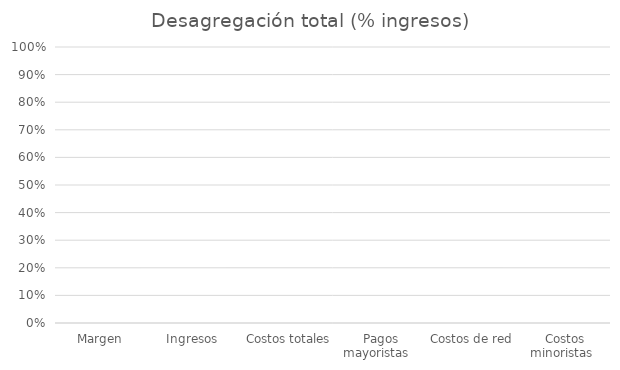
| Category | Series 0 |
|---|---|
|  Margen  | 0 |
|  Ingresos  | 0 |
|  Costos totales  | 0 |
|  Pagos mayoristas  | 0 |
|  Costos de red  | 0 |
|  Costos minoristas  | 0 |